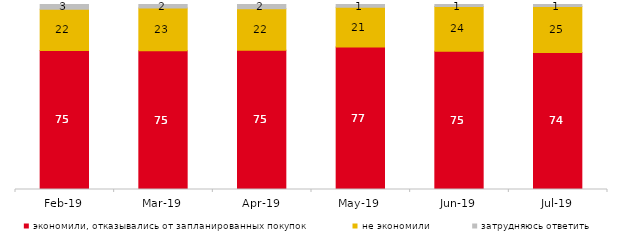
| Category | экономили, отказывались от запланированных покупок | не экономили | затрудняюсь ответить |
|---|---|---|---|
| 2019-02-01 | 75.2 | 22.2 | 2.6 |
| 2019-03-01 | 75.037 | 23.023 | 1.939 |
| 2019-04-01 | 75.297 | 22.426 | 2.277 |
| 2019-05-01 | 77.068 | 21.496 | 1.436 |
| 2019-06-01 | 74.663 | 24.239 | 1.097 |
| 2019-07-01 | 74.109 | 24.752 | 1.139 |